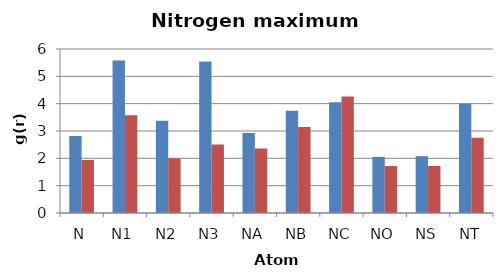
| Category | OW | HW |
|---|---|---|
| N | 2.82 | 1.941 |
| N1 | 5.581 | 3.58 |
| N2 | 3.375 | 2 |
| N3 | 5.538 | 2.51 |
| NA | 2.931 | 2.357 |
| NB | 3.743 | 3.143 |
| NC | 4.053 | 4.265 |
| NO | 2.055 | 1.717 |
| NS | 2.078 | 1.719 |
| NT | 3.994 | 2.755 |